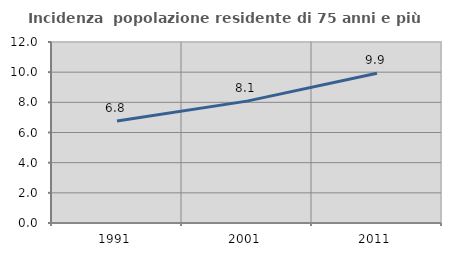
| Category | Incidenza  popolazione residente di 75 anni e più |
|---|---|
| 1991.0 | 6.765 |
| 2001.0 | 8.08 |
| 2011.0 | 9.927 |